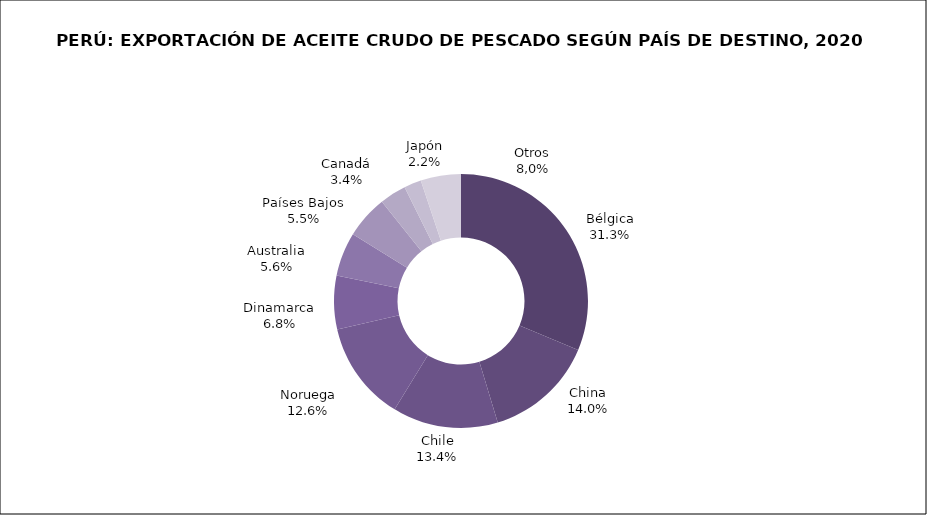
| Category | Series 0 |
|---|---|
| Bélgica | 33899.17 |
| China | 15168.54 |
| Chile | 14526.685 |
| Noruega | 13690.665 |
| Dinamarca | 7375.34 |
| Australia | 6046.97 |
| Países Bajos | 5957.87 |
| Canadá | 3660.12 |
| Japón | 2378.16 |
| Otros | 5547.5 |